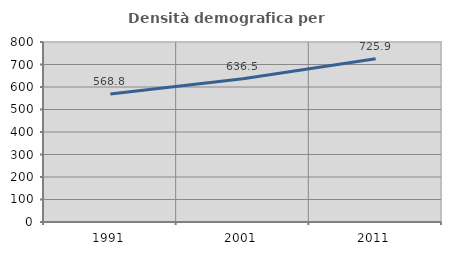
| Category | Densità demografica |
|---|---|
| 1991.0 | 568.778 |
| 2001.0 | 636.516 |
| 2011.0 | 725.938 |